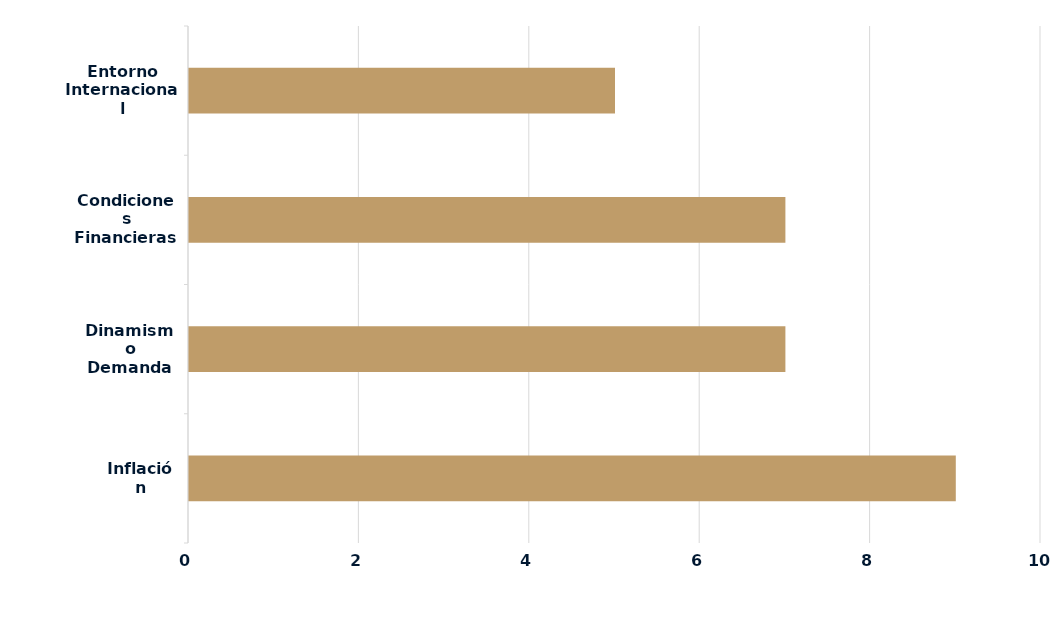
| Category | Series 0 |
|---|---|
| Inflación | 9 |
| Dinamismo Demanda | 7 |
| Condiciones Financieras Locales | 7 |
| Entorno Internacional | 5 |